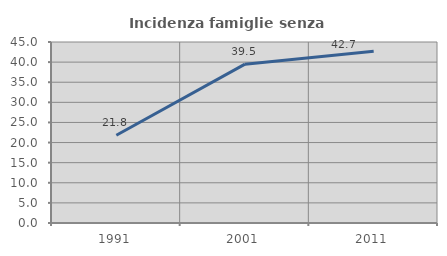
| Category | Incidenza famiglie senza nuclei |
|---|---|
| 1991.0 | 21.811 |
| 2001.0 | 39.49 |
| 2011.0 | 42.679 |